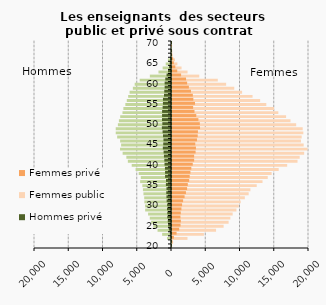
| Category | Femmes public | Femmes privé |
|---|---|---|
| 20.0 | 5 | 2 |
| 21.0 | 158 | 52 |
| 22.0 | 2262 | 279 |
| 23.0 | 4657 | 667 |
| 24.0 | 6430 | 1045 |
| 25.0 | 7535 | 1247 |
| 26.0 | 8262 | 1296 |
| 27.0 | 8519 | 1236 |
| 28.0 | 8854 | 1284 |
| 29.0 | 9407 | 1375 |
| 30.0 | 9755 | 1472 |
| 31.0 | 10031 | 1620 |
| 32.0 | 10631 | 1837 |
| 33.0 | 11191 | 2034 |
| 34.0 | 11444 | 2202 |
| 35.0 | 12369 | 2306 |
| 36.0 | 13214 | 2508 |
| 37.0 | 13976 | 2586 |
| 38.0 | 14543 | 2690 |
| 39.0 | 15574 | 2822 |
| 40.0 | 16814 | 3029 |
| 41.0 | 18324 | 3230 |
| 42.0 | 18639 | 3230 |
| 43.0 | 19293 | 3445 |
| 44.0 | 19788 | 3495 |
| 45.0 | 19219 | 3397 |
| 46.0 | 18826 | 3643 |
| 47.0 | 18928 | 3754 |
| 48.0 | 19173 | 3787 |
| 49.0 | 19077 | 4093 |
| 50.0 | 18127 | 4061 |
| 51.0 | 17296 | 3855 |
| 52.0 | 16654 | 3546 |
| 53.0 | 15522 | 3285 |
| 54.0 | 14894 | 3086 |
| 55.0 | 13766 | 3358 |
| 56.0 | 12866 | 3115 |
| 57.0 | 11758 | 3042 |
| 58.0 | 10233 | 2768 |
| 59.0 | 9089 | 2463 |
| 60.0 | 7903 | 2210 |
| 61.0 | 6683 | 2050 |
| 62.0 | 3978 | 1328 |
| 63.0 | 2268 | 767 |
| 64.0 | 1392 | 483 |
| 65.0 | 785 | 268 |
| 66.0 | 442 | 173 |
| 67.0 | 88 | 23 |
| 68.0 | 38 | 4 |
| 69.0 | 2 | 2 |
| 70.0 | 0 | 1 |